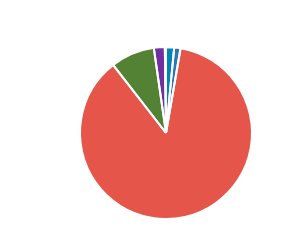
| Category | Series 0 |
|---|---|
| PC | 176 |
| MC | 137 |
| CAR | 10020 |
| LGV | 951 |
| OGV1 | 237 |
| OGV2 | 23 |
| PSV | 2 |